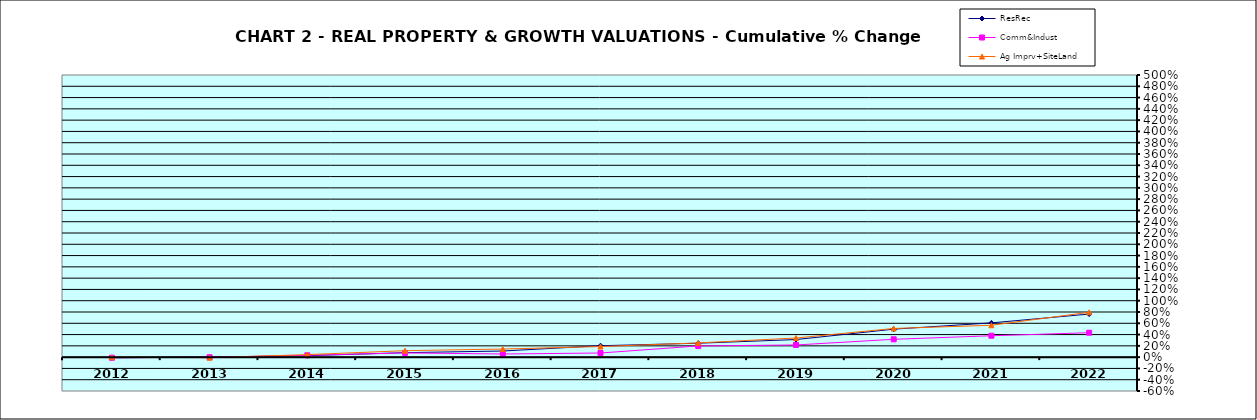
| Category | ResRec | Comm&Indust | Ag Imprv+SiteLand |
|---|---|---|---|
| 2012.0 | -0.01 | -0.011 | 0 |
| 2013.0 | 0.001 | -0.002 | -0.01 |
| 2014.0 | 0.026 | 0.033 | 0.045 |
| 2015.0 | 0.079 | 0.075 | 0.114 |
| 2016.0 | 0.109 | 0.056 | 0.144 |
| 2017.0 | 0.202 | 0.073 | 0.188 |
| 2018.0 | 0.247 | 0.198 | 0.252 |
| 2019.0 | 0.312 | 0.216 | 0.339 |
| 2020.0 | 0.496 | 0.316 | 0.508 |
| 2021.0 | 0.607 | 0.379 | 0.565 |
| 2022.0 | 0.763 | 0.433 | 0.795 |